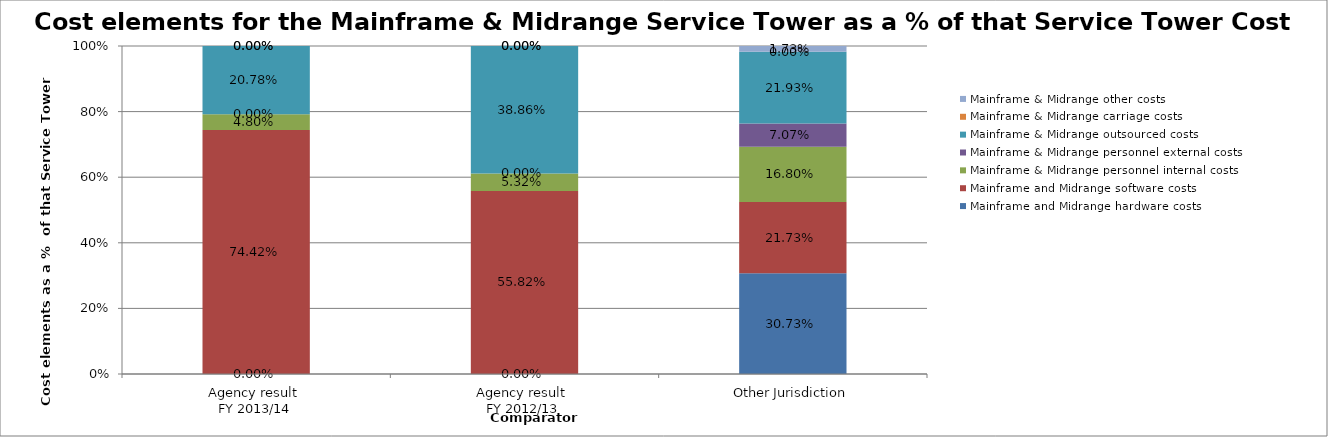
| Category | Mainframe and Midrange hardware costs | Mainframe and Midrange software costs | Mainframe & Midrange personnel internal costs | Mainframe & Midrange personnel external costs | Mainframe & Midrange outsourced costs | Mainframe & Midrange carriage costs | Mainframe & Midrange other costs |
|---|---|---|---|---|---|---|---|
| Agency result 
FY 2013/14 | 0 | 0.744 | 0.048 | 0 | 0.208 | 0 | 0 |
| Agency result 
FY 2012/13 | 0 | 0.558 | 0.053 | 0 | 0.389 | 0 | 0 |
| Other Jurisdiction | 0.307 | 0.217 | 0.168 | 0.071 | 0.219 | 0 | 0.017 |